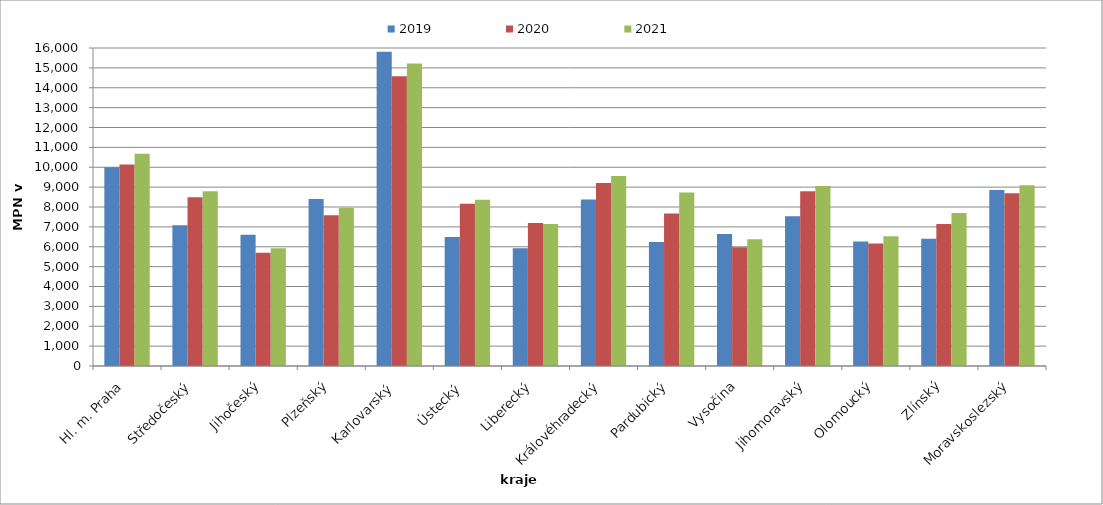
| Category | 2019 | 2020 | 2021 |
|---|---|---|---|
| Hl. m. Praha | 10002.286 | 10140.043 | 10675.773 |
| Středočeský | 7077.522 | 8485.2 | 8795.803 |
| Jihočeský | 6601.722 | 5695.028 | 5922.829 |
| Plzeňský | 8408 | 7587 | 7966.5 |
| Karlovarský  | 15806.897 | 14580 | 15219.512 |
| Ústecký   | 6495.652 | 8168.556 | 8361.263 |
| Liberecký | 5923.061 | 7195.196 | 7140.111 |
| Královéhradecký | 8377.465 | 9205.72 | 9555.873 |
| Pardubický | 6238.655 | 7676.386 | 8725.301 |
| Vysočina | 6645.654 | 5975.429 | 6371.72 |
| Jihomoravský | 7531.309 | 8788.295 | 9050.656 |
| Olomoucký | 6259.92 | 6159.3 | 6528.9 |
| Zlínský | 6399.191 | 7149.711 | 7699.422 |
| Moravskoslezský | 8860.439 | 8687.415 | 9093.369 |